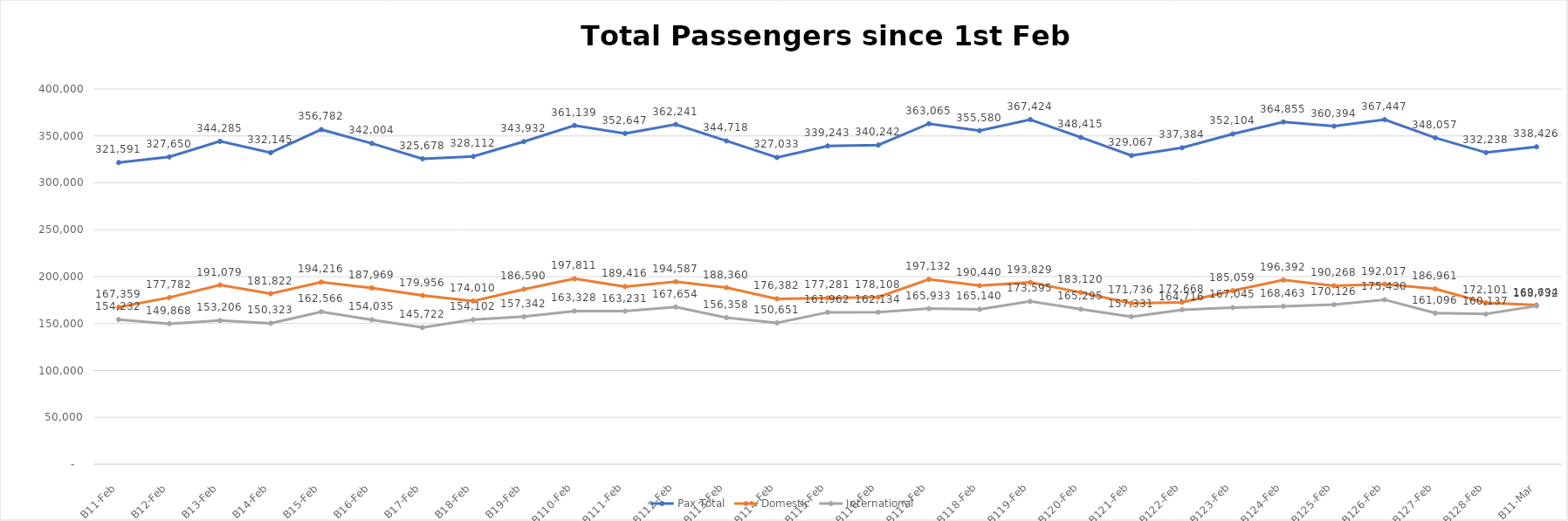
| Category | Pax Total |  Domestic  |  International  |
|---|---|---|---|
| 2023-02-01 | 321591 | 167359 | 154232 |
| 2023-02-02 | 327650 | 177782 | 149868 |
| 2023-02-03 | 344285 | 191079 | 153206 |
| 2023-02-04 | 332145 | 181822 | 150323 |
| 2023-02-05 | 356782 | 194216 | 162566 |
| 2023-02-06 | 342004 | 187969 | 154035 |
| 2023-02-07 | 325678 | 179956 | 145722 |
| 2023-02-08 | 328112 | 174010 | 154102 |
| 2023-02-09 | 343932 | 186590 | 157342 |
| 2023-02-10 | 361139 | 197811 | 163328 |
| 2023-02-11 | 352647 | 189416 | 163231 |
| 2023-02-12 | 362241 | 194587 | 167654 |
| 2023-02-13 | 344718 | 188360 | 156358 |
| 2023-02-14 | 327033 | 176382 | 150651 |
| 2023-02-15 | 339243 | 177281 | 161962 |
| 2023-02-16 | 340242 | 178108 | 162134 |
| 2023-02-17 | 363065 | 197132 | 165933 |
| 2023-02-18 | 355580 | 190440 | 165140 |
| 2023-02-19 | 367424 | 193829 | 173595 |
| 2023-02-20 | 348415 | 183120 | 165295 |
| 2023-02-21 | 329067 | 171736 | 157331 |
| 2023-02-22 | 337384 | 172668 | 164716 |
| 2023-02-23 | 352104 | 185059 | 167045 |
| 2023-02-24 | 364855 | 196392 | 168463 |
| 2023-02-25 | 360394 | 190268 | 170126 |
| 2023-02-26 | 367447 | 192017 | 175430 |
| 2023-02-27 | 348057 | 186961 | 161096 |
| 2023-02-28 | 332238 | 172101 | 160137 |
| 2023-03-01 | 338426 | 169694 | 168732 |